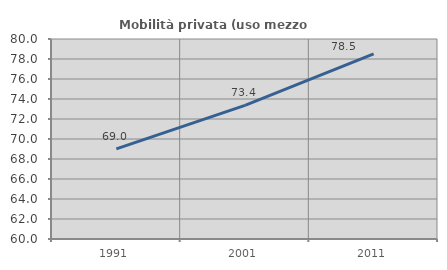
| Category | Mobilità privata (uso mezzo privato) |
|---|---|
| 1991.0 | 69.005 |
| 2001.0 | 73.363 |
| 2011.0 | 78.51 |